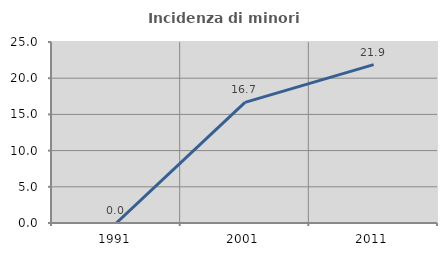
| Category | Incidenza di minori stranieri |
|---|---|
| 1991.0 | 0 |
| 2001.0 | 16.667 |
| 2011.0 | 21.875 |